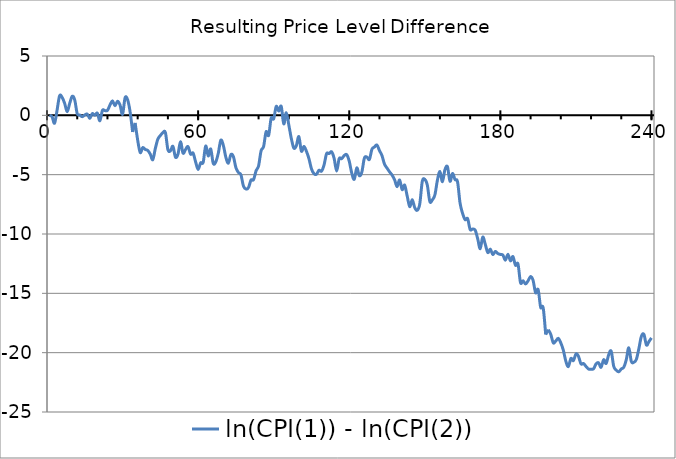
| Category | ln(CPI(1)) - ln(CPI(2)) |
|---|---|
| 1.0 | 0 |
| 2.0 | -0.112 |
| 3.0 | -0.664 |
| 4.0 | 0.438 |
| 5.0 | 1.643 |
| 6.0 | 1.512 |
| 7.0 | 1.017 |
| 8.0 | 0.304 |
| 9.0 | 0.997 |
| 10.0 | 1.601 |
| 11.0 | 1.304 |
| 12.0 | 0.139 |
| 13.0 | 0.028 |
| 14.0 | -0.116 |
| 15.0 | 0.034 |
| 16.0 | 0.101 |
| 17.0 | -0.259 |
| 18.0 | 0.149 |
| 19.0 | 0.011 |
| 20.0 | 0.179 |
| 21.0 | -0.455 |
| 22.0 | 0.416 |
| 23.0 | 0.397 |
| 24.0 | 0.415 |
| 25.0 | 0.867 |
| 26.0 | 1.22 |
| 27.0 | 0.811 |
| 28.0 | 1.188 |
| 29.0 | 0.871 |
| 30.0 | 0.086 |
| 31.0 | 1.478 |
| 32.0 | 1.315 |
| 33.0 | 0.287 |
| 34.0 | -1.402 |
| 35.0 | -0.641 |
| 36.0 | -2.081 |
| 37.0 | -3.133 |
| 38.0 | -2.719 |
| 39.0 | -2.872 |
| 40.0 | -2.959 |
| 41.0 | -3.271 |
| 42.0 | -3.74 |
| 43.0 | -2.803 |
| 44.0 | -2.012 |
| 45.0 | -1.705 |
| 46.0 | -1.459 |
| 47.0 | -1.441 |
| 48.0 | -2.887 |
| 49.0 | -2.997 |
| 50.0 | -2.61 |
| 51.0 | -3.524 |
| 52.0 | -3.269 |
| 53.0 | -2.217 |
| 54.0 | -3.187 |
| 55.0 | -2.881 |
| 56.0 | -2.637 |
| 57.0 | -3.271 |
| 58.0 | -3.184 |
| 59.0 | -3.92 |
| 60.0 | -4.559 |
| 61.0 | -4.006 |
| 62.0 | -3.968 |
| 63.0 | -2.587 |
| 64.0 | -3.418 |
| 65.0 | -2.835 |
| 66.0 | -4.042 |
| 67.0 | -3.929 |
| 68.0 | -3.202 |
| 69.0 | -2.103 |
| 70.0 | -2.524 |
| 71.0 | -3.522 |
| 72.0 | -4.03 |
| 73.0 | -3.314 |
| 74.0 | -3.473 |
| 75.0 | -4.405 |
| 76.0 | -4.82 |
| 77.0 | -5.009 |
| 78.0 | -5.963 |
| 79.0 | -6.212 |
| 80.0 | -6.087 |
| 81.0 | -5.455 |
| 82.0 | -5.425 |
| 83.0 | -4.679 |
| 84.0 | -4.258 |
| 85.0 | -2.994 |
| 86.0 | -2.622 |
| 87.0 | -1.379 |
| 88.0 | -1.69 |
| 89.0 | -0.242 |
| 90.0 | -0.288 |
| 91.0 | 0.747 |
| 92.0 | 0.356 |
| 93.0 | 0.759 |
| 94.0 | -0.718 |
| 95.0 | 0.223 |
| 96.0 | -0.807 |
| 97.0 | -1.946 |
| 98.0 | -2.758 |
| 99.0 | -2.552 |
| 100.0 | -1.794 |
| 101.0 | -3.016 |
| 102.0 | -2.619 |
| 103.0 | -3.028 |
| 104.0 | -3.65 |
| 105.0 | -4.51 |
| 106.0 | -4.916 |
| 107.0 | -4.96 |
| 108.0 | -4.628 |
| 109.0 | -4.704 |
| 110.0 | -4.18 |
| 111.0 | -3.227 |
| 112.0 | -3.223 |
| 113.0 | -3.075 |
| 114.0 | -3.626 |
| 115.0 | -4.694 |
| 116.0 | -3.649 |
| 117.0 | -3.654 |
| 118.0 | -3.393 |
| 119.0 | -3.317 |
| 120.0 | -3.862 |
| 121.0 | -4.868 |
| 122.0 | -5.388 |
| 123.0 | -4.427 |
| 124.0 | -5.084 |
| 125.0 | -4.783 |
| 126.0 | -3.613 |
| 127.0 | -3.514 |
| 128.0 | -3.717 |
| 129.0 | -2.866 |
| 130.0 | -2.668 |
| 131.0 | -2.504 |
| 132.0 | -2.967 |
| 133.0 | -3.396 |
| 134.0 | -4.113 |
| 135.0 | -4.447 |
| 136.0 | -4.76 |
| 137.0 | -5.031 |
| 138.0 | -5.428 |
| 139.0 | -6.012 |
| 140.0 | -5.447 |
| 141.0 | -6.257 |
| 142.0 | -5.882 |
| 143.0 | -6.793 |
| 144.0 | -7.693 |
| 145.0 | -7.109 |
| 146.0 | -7.779 |
| 147.0 | -7.996 |
| 148.0 | -7.468 |
| 149.0 | -5.565 |
| 150.0 | -5.397 |
| 151.0 | -5.883 |
| 152.0 | -7.264 |
| 153.0 | -7.12 |
| 154.0 | -6.71 |
| 155.0 | -5.477 |
| 156.0 | -4.727 |
| 157.0 | -5.59 |
| 158.0 | -4.576 |
| 159.0 | -4.334 |
| 160.0 | -5.553 |
| 161.0 | -4.899 |
| 162.0 | -5.412 |
| 163.0 | -5.601 |
| 164.0 | -7.396 |
| 165.0 | -8.263 |
| 166.0 | -8.789 |
| 167.0 | -8.708 |
| 168.0 | -9.617 |
| 169.0 | -9.579 |
| 170.0 | -9.679 |
| 171.0 | -10.398 |
| 172.0 | -11.243 |
| 173.0 | -10.261 |
| 174.0 | -10.861 |
| 175.0 | -11.562 |
| 176.0 | -11.273 |
| 177.0 | -11.733 |
| 178.0 | -11.466 |
| 179.0 | -11.648 |
| 180.0 | -11.721 |
| 181.0 | -11.775 |
| 182.0 | -12.208 |
| 183.0 | -11.714 |
| 184.0 | -12.261 |
| 185.0 | -11.903 |
| 186.0 | -12.637 |
| 187.0 | -12.526 |
| 188.0 | -14.099 |
| 189.0 | -13.939 |
| 190.0 | -14.214 |
| 191.0 | -13.946 |
| 192.0 | -13.584 |
| 193.0 | -13.914 |
| 194.0 | -14.958 |
| 195.0 | -14.686 |
| 196.0 | -16.175 |
| 197.0 | -16.214 |
| 198.0 | -18.472 |
| 199.0 | -18.063 |
| 200.0 | -18.449 |
| 201.0 | -19.17 |
| 202.0 | -19.015 |
| 203.0 | -18.793 |
| 204.0 | -19.179 |
| 205.0 | -19.789 |
| 206.0 | -20.719 |
| 207.0 | -21.174 |
| 208.0 | -20.488 |
| 209.0 | -20.67 |
| 210.0 | -20.115 |
| 211.0 | -20.3 |
| 212.0 | -20.941 |
| 213.0 | -20.916 |
| 214.0 | -21.158 |
| 215.0 | -21.378 |
| 216.0 | -21.388 |
| 217.0 | -21.36 |
| 218.0 | -20.944 |
| 219.0 | -20.855 |
| 220.0 | -21.235 |
| 221.0 | -20.592 |
| 222.0 | -20.91 |
| 223.0 | -20.188 |
| 224.0 | -19.871 |
| 225.0 | -21.146 |
| 226.0 | -21.469 |
| 227.0 | -21.611 |
| 228.0 | -21.375 |
| 229.0 | -21.227 |
| 230.0 | -20.585 |
| 231.0 | -19.584 |
| 232.0 | -20.738 |
| 233.0 | -20.813 |
| 234.0 | -20.559 |
| 235.0 | -19.651 |
| 236.0 | -18.619 |
| 237.0 | -18.464 |
| 238.0 | -19.354 |
| 239.0 | -19.063 |
| 240.0 | -18.754 |